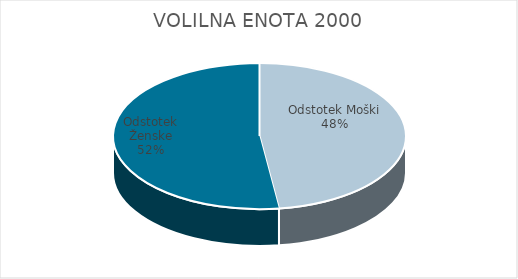
| Category | VOLILNA ENOTA 2000 | #REF! | Slovenija skupaj |
|---|---|---|---|
| Odstotek Moški | 24.04 |  | 25.28 |
| Odstotek Ženske | 26.17 |  | 27.73 |